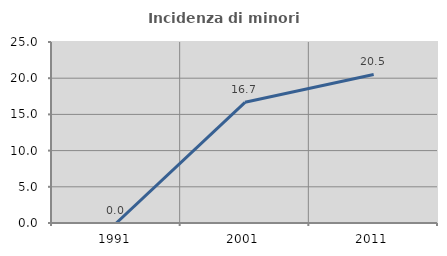
| Category | Incidenza di minori stranieri |
|---|---|
| 1991.0 | 0 |
| 2001.0 | 16.667 |
| 2011.0 | 20.513 |